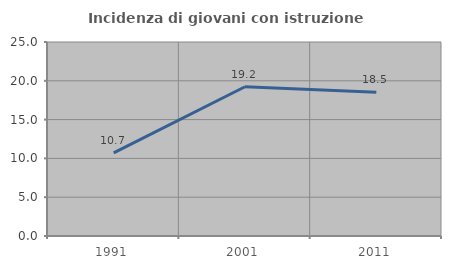
| Category | Incidenza di giovani con istruzione universitaria |
|---|---|
| 1991.0 | 10.714 |
| 2001.0 | 19.231 |
| 2011.0 | 18.519 |